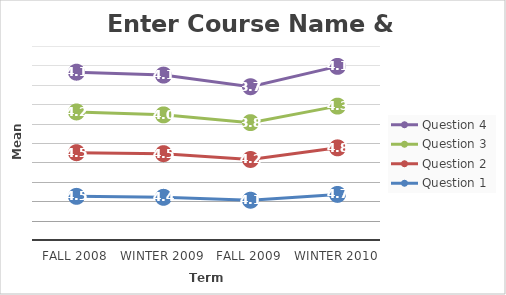
| Category | Question 1 | Question 2 | Question 3 | Question 4 |
|---|---|---|---|---|
| Fall 2008 | 4.5 | 4.5 | 4.2 | 4.1 |
| Winter 2009 | 4.4 | 4.5 | 4 | 4.1 |
| Fall 2009 | 4.1 | 4.2 | 3.8 | 3.7 |
| Winter 2010 | 4.7 | 4.8 | 4.3 | 4.1 |